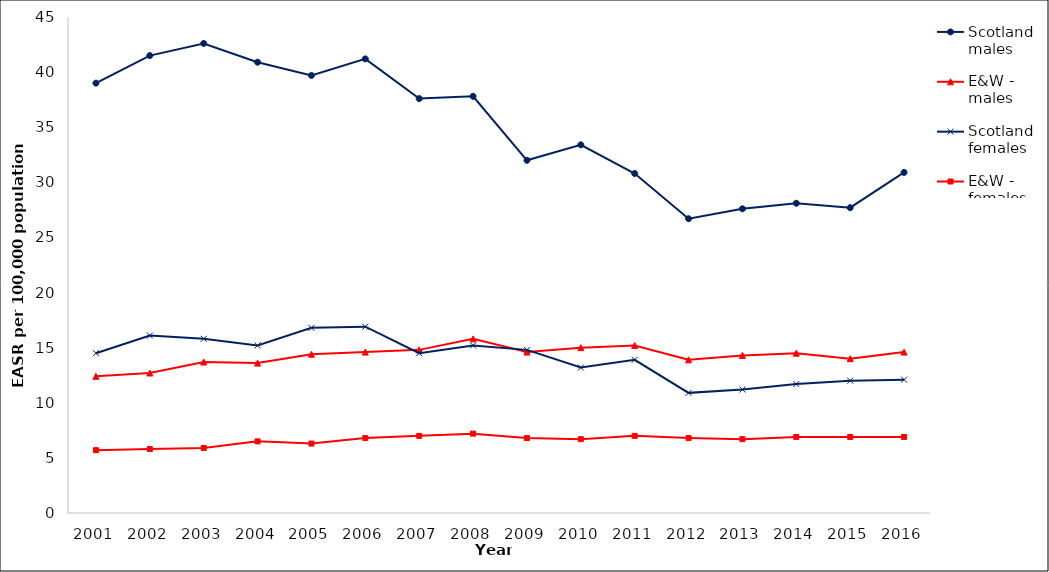
| Category | Scotland - males | E&W - males | Scotland - females | E&W - females |
|---|---|---|---|---|
| 2001.0 | 39 | 12.4 | 14.5 | 5.7 |
| 2002.0 | 41.5 | 12.7 | 16.1 | 5.8 |
| 2003.0 | 42.6 | 13.7 | 15.8 | 5.9 |
| 2004.0 | 40.9 | 13.6 | 15.2 | 6.5 |
| 2005.0 | 39.7 | 14.4 | 16.8 | 6.3 |
| 2006.0 | 41.2 | 14.6 | 16.9 | 6.8 |
| 2007.0 | 37.6 | 14.8 | 14.5 | 7 |
| 2008.0 | 37.8 | 15.8 | 15.2 | 7.2 |
| 2009.0 | 32 | 14.6 | 14.8 | 6.8 |
| 2010.0 | 33.4 | 15 | 13.2 | 6.7 |
| 2011.0 | 30.8 | 15.2 | 13.9 | 7 |
| 2012.0 | 26.7 | 13.9 | 10.9 | 6.8 |
| 2013.0 | 27.6 | 14.3 | 11.2 | 6.7 |
| 2014.0 | 28.1 | 14.5 | 11.7 | 6.9 |
| 2015.0 | 27.7 | 14 | 12 | 6.9 |
| 2016.0 | 30.9 | 14.6 | 12.1 | 6.9 |